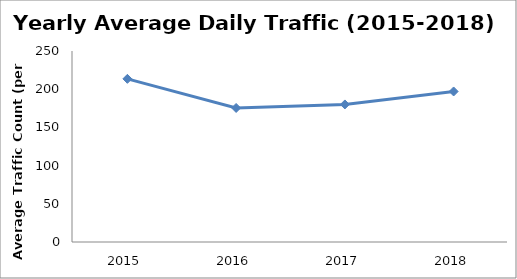
| Category | Series 0 |
|---|---|
| 2015.0 | 213.545 |
| 2016.0 | 175.437 |
| 2017.0 | 180.047 |
| 2018.0 | 197.019 |